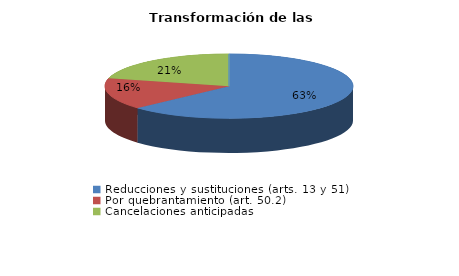
| Category | Series 0 |
|---|---|
| Reducciones y sustituciones (arts. 13 y 51) | 12 |
| Por quebrantamiento (art. 50.2) | 3 |
| Cancelaciones anticipadas | 4 |
| Traslado a Centros Penitenciarios | 0 |
| Conversión internamientos en cerrados (art. 51.2) | 0 |